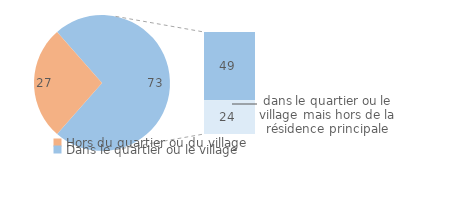
| Category | Series 0 |
|---|---|
| Hors du quartier ou du village | 27.04 |
| Ne sait pas/Refus | 0.01 |
| Dans le quartier ou le village | 48.79 |